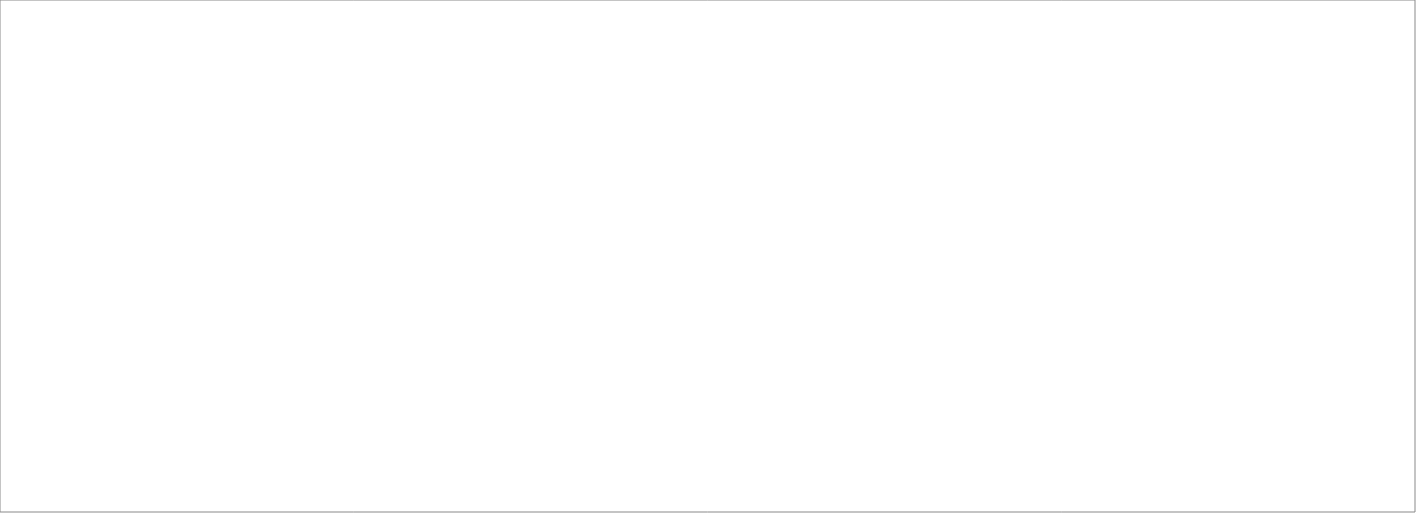
| Category | Total |
|---|---|
| Assessio Sverige AB | 100 |
| Michael Catenacci AB | 70 |
| AB Effektiv Borås AB | 70 |
| OnePartner Group AB | 70 |
| Randstad AB | 70 |